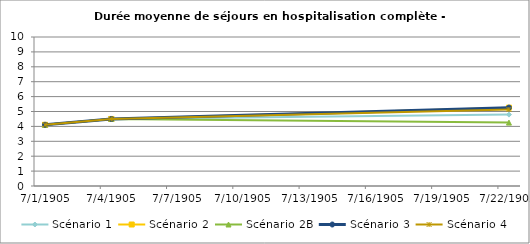
| Category | Scénario 1 | Scénario 2 | Scénario 2B | Scénario 3 | Scénario 4 |
|---|---|---|---|---|---|
| 2009.0 | 4.108 | 4.108 | 4.108 | 4.108 | 4.108 |
| 2012.0 | 4.498 | 4.498 | 4.498 | 4.498 | 4.498 |
| 2030.0 | 4.791 | 5.259 | 4.254 | 5.259 | 5.136 |